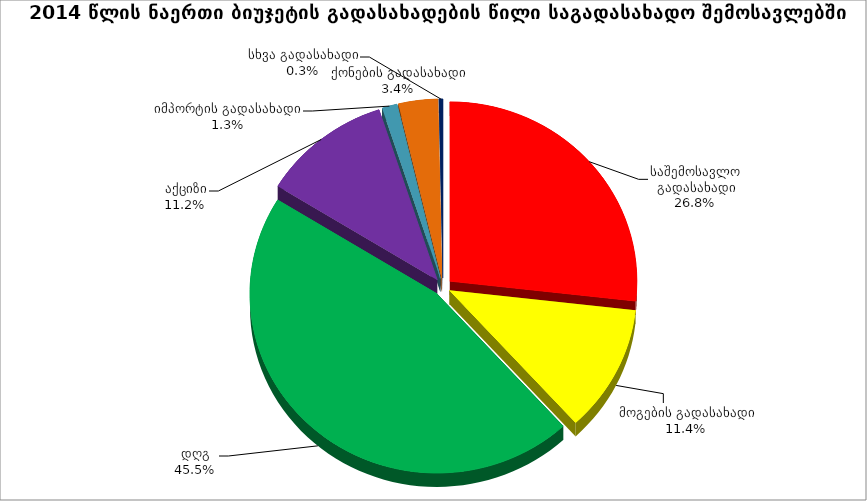
| Category | Series 0 |
|---|---|
| საშემოსავლო გადასახადი | 0.268 |
| მოგების გადასახადი | 0.114 |
| დღგ | 0.455 |
| აქციზი | 0.112 |
| იმპორტის გადასახადი | 0.013 |
| ქონების გადასახადი | 0.034 |
| სხვა გადასახადი | 0.003 |